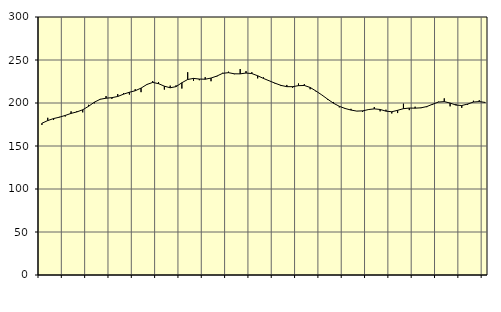
| Category | Piggar | Series 1 |
|---|---|---|
| nan | 174.5 | 176.45 |
| 1.0 | 182.8 | 179.55 |
| 1.0 | 180.2 | 181.93 |
| 1.0 | 183.9 | 183.47 |
| nan | 184.3 | 185.55 |
| 2.0 | 190.3 | 187.91 |
| 2.0 | 190.5 | 189.64 |
| 2.0 | 189.1 | 192.12 |
| nan | 197.9 | 196.16 |
| 3.0 | 199.6 | 200.98 |
| 3.0 | 204.7 | 204.34 |
| 3.0 | 208.1 | 205.59 |
| nan | 204.8 | 206.2 |
| 4.0 | 210.4 | 207.58 |
| 4.0 | 211.5 | 210.27 |
| 4.0 | 209.8 | 212.49 |
| nan | 216.1 | 214.24 |
| 5.0 | 212.6 | 217.3 |
| 5.0 | 221.9 | 221.53 |
| 5.0 | 225.5 | 223.92 |
| nan | 224.3 | 222.5 |
| 6.0 | 215.6 | 219.56 |
| 6.0 | 220.2 | 217.68 |
| 6.0 | 220.5 | 219.04 |
| nan | 216.8 | 223.55 |
| 7.0 | 235.8 | 227.33 |
| 7.0 | 225.8 | 228.6 |
| 7.0 | 226.5 | 227.85 |
| nan | 230 | 227.65 |
| 8.0 | 225.3 | 228.98 |
| 8.0 | 230.8 | 231.34 |
| 8.0 | 235.1 | 234.51 |
| nan | 236.4 | 235.26 |
| 9.0 | 233.5 | 233.95 |
| 9.0 | 239.5 | 233.89 |
| 9.0 | 237.1 | 234.84 |
| nan | 235.8 | 234.24 |
| 10.0 | 228.6 | 231.67 |
| 10.0 | 229.8 | 228.56 |
| 10.0 | 225.6 | 225.73 |
| nan | 222.3 | 222.98 |
| 11.0 | 219.7 | 220.48 |
| 11.0 | 221 | 218.99 |
| 11.0 | 217.7 | 218.97 |
| nan | 222.7 | 220.18 |
| 12.0 | 221.9 | 220.38 |
| 12.0 | 216 | 218.07 |
| 12.0 | 213.5 | 213.95 |
| nan | 209.3 | 209.37 |
| 13.0 | 203.7 | 204.46 |
| 13.0 | 201.2 | 199.74 |
| 13.0 | 194.9 | 196.17 |
| nan | 194.2 | 193.62 |
| 14.0 | 193.2 | 191.8 |
| 14.0 | 190.5 | 190.58 |
| 14.0 | 189.6 | 190.85 |
| nan | 192.7 | 192.36 |
| 15.0 | 195.3 | 193.17 |
| 15.0 | 190.3 | 192.49 |
| 15.0 | 192.2 | 190.53 |
| nan | 187.8 | 189.82 |
| 16.0 | 188.3 | 191.49 |
| 16.0 | 199.2 | 193.39 |
| 16.0 | 191.7 | 194.13 |
| nan | 195.7 | 193.99 |
| 17.0 | 194.1 | 194.39 |
| 17.0 | 195.2 | 195.85 |
| 17.0 | 197.8 | 198.57 |
| nan | 201.5 | 201.08 |
| 18.0 | 205.4 | 201.61 |
| 18.0 | 196.1 | 199.92 |
| 18.0 | 198.9 | 197.57 |
| nan | 194.4 | 197.06 |
| 19.0 | 197.8 | 198.76 |
| 19.0 | 202.6 | 201.12 |
| 19.0 | 203.2 | 201.66 |
| nan | 200.2 | 200.68 |